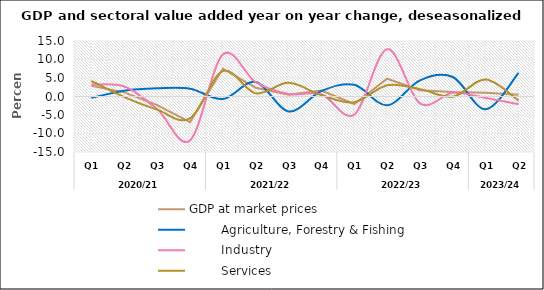
| Category | GDP at market prices |         Agriculture, Forestry & Fishing |         Industry |         Services |
|---|---|---|---|---|
| 0 | 2.895 | -0.379 | 3.219 | 4.19 |
| 1 | 1.115 | 1.563 | 2.716 | -0.149 |
| 2 | -2.327 | 2.199 | -3.403 | -3.555 |
| 3 | -6.924 | 2.109 | -11.877 | -5.937 |
| 4 | 7.506 | -0.675 | 11.352 | 6.904 |
| 5 | 2.373 | 3.928 | 3.86 | 0.846 |
| 6 | 0.476 | -4.041 | 0.657 | 3.689 |
| 7 | 1.617 | 1.49 | 0.602 | 0.361 |
| 8 | -2.032 | 3.154 | -4.882 | -1.547 |
| 9 | 4.807 | -2.357 | 12.798 | 3.039 |
| 10 | 1.72 | 4.364 | -1.874 | 1.991 |
| 11 | 1.24 | 5.27 | 0.984 | -0.054 |
| 12 | 1.017 | -3.452 | -0.411 | 4.613 |
| 13 | 0.499 | 6.366 | -2.061 | -1.106 |